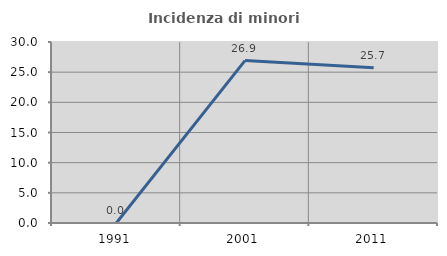
| Category | Incidenza di minori stranieri |
|---|---|
| 1991.0 | 0 |
| 2001.0 | 26.923 |
| 2011.0 | 25.714 |